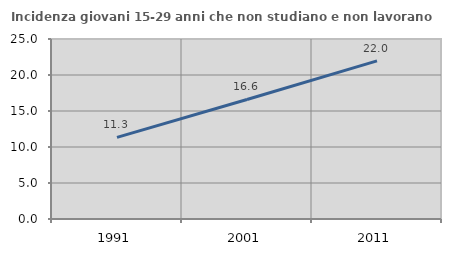
| Category | Incidenza giovani 15-29 anni che non studiano e non lavorano  |
|---|---|
| 1991.0 | 11.345 |
| 2001.0 | 16.604 |
| 2011.0 | 21.97 |